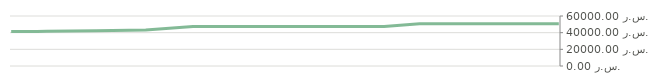
| Category | ربع سنوي  |
|---|---|
| 2013-04-23 | 50800 |
| 2013-04-25 | 50800 |
| 2013-05-07 | 50800 |
| 2013-05-14 | 50800 |
| 2013-05-14 | 50800 |
| 2013-05-29 | 50800 |
| 2013-06-10 | 50800 |
| 2013-06-21 | 50800 |
| 2013-07-06 | 47400 |
| 2013-08-05 | 47400 |
| 2013-08-19 | 47400 |
| 2013-09-04 | 47400 |
| 2013-09-20 | 47400 |
| 2013-09-25 | 47400 |
| 2013-10-15 | 43258.14 |
| 2013-11-05 | 42312.903 |
| 2013-11-26 | 41811.111 |
| 2013-11-30 | 41500 |
| 2013-12-11 | 41288.235 |